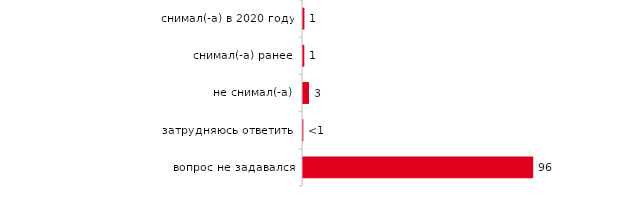
| Category | Series 0 |
|---|---|
| снимал(-а) в 2020 году | 0.6 |
| снимал(-а) ранее | 0.55 |
| не снимал(-а) | 2.5 |
| затрудняюсь ответить | 0.15 |
| вопрос не задавался | 96.25 |